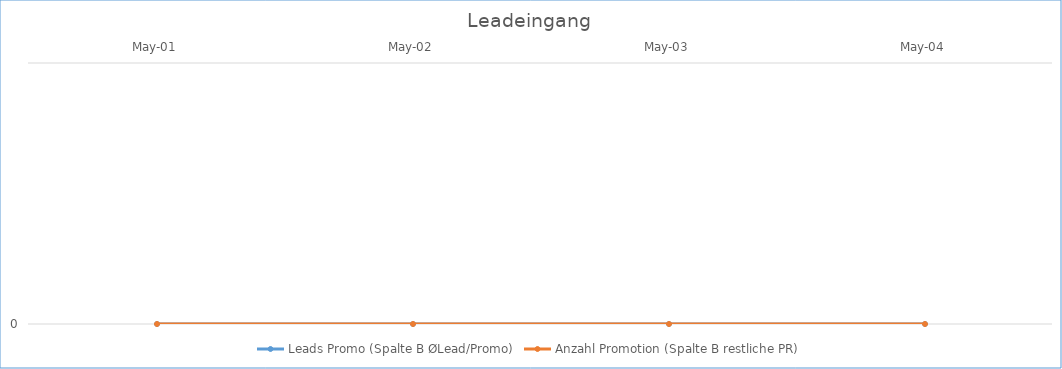
| Category | Leads Promo (Spalte B ØLead/Promo) | Anzahl Promotion (Spalte B restliche PR) |
|---|---|---|
| 2001-05-01 | 0 | 0 |
| 2002-05-01 | 0 | 0 |
| 2003-05-01 | 0 | 0 |
| 2004-05-01 | 0 | 0 |